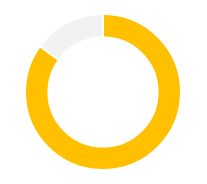
| Category | Series 0 |
|---|---|
| 0 | 0 |
| 1 | 0.85 |
| 2 | 0 |
| 3 | 0.15 |